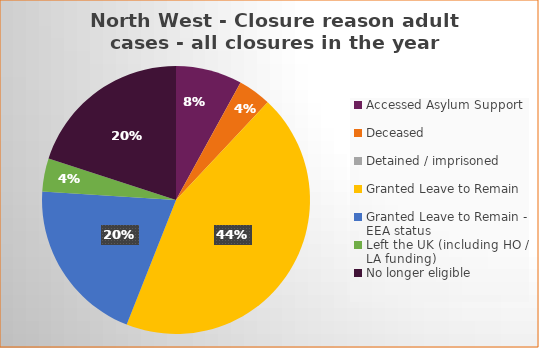
| Category | Total | Percentage |
|---|---|---|
| Accessed Asylum Support | 2 | 0.08 |
| Deceased | 1 | 0.04 |
| Detained / imprisoned | 0 | 0 |
| Granted Leave to Remain | 11 | 0.44 |
| Granted Leave to Remain - EEA status | 5 | 0.2 |
| Left the UK (including HO / LA funding)  | 1 | 0.04 |
| No longer eligible | 5 | 0.2 |